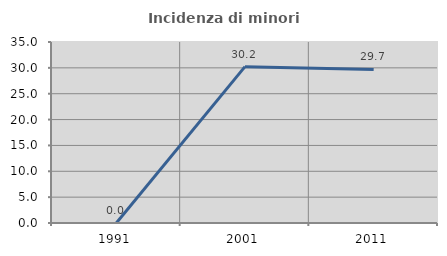
| Category | Incidenza di minori stranieri |
|---|---|
| 1991.0 | 0 |
| 2001.0 | 30.233 |
| 2011.0 | 29.688 |